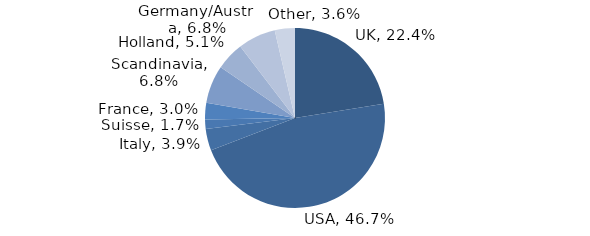
| Category | Investment Style |
|---|---|
| UK | 0.224 |
| USA | 0.467 |
| Italy | 0.039 |
| Suisse | 0.017 |
| France | 0.03 |
| Scandinavia | 0.068 |
| Holland | 0.051 |
| Germany/Austria | 0.068 |
| Other | 0.036 |